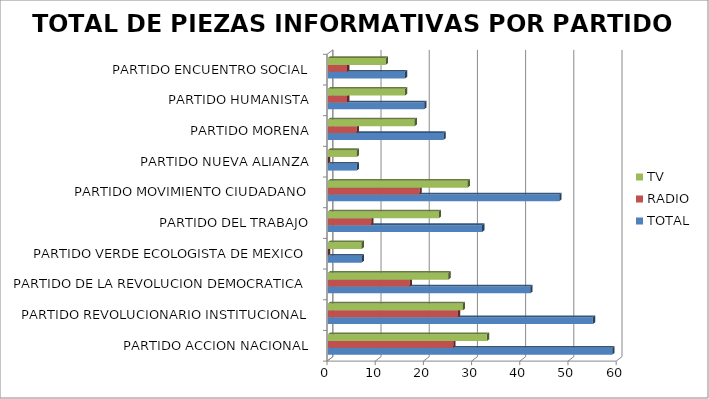
| Category | TOTAL | RADIO | TV |
|---|---|---|---|
| PARTIDO ACCION NACIONAL | 59 | 26 | 33 |
| PARTIDO REVOLUCIONARIO INSTITUCIONAL | 55 | 27 | 28 |
| PARTIDO DE LA REVOLUCION DEMOCRATICA | 42 | 17 | 25 |
| PARTIDO VERDE ECOLOGISTA DE MEXICO | 7 | 0 | 7 |
| PARTIDO DEL TRABAJO | 32 | 9 | 23 |
| PARTIDO MOVIMIENTO CIUDADANO | 48 | 19 | 29 |
| PARTIDO NUEVA ALIANZA | 6 | 0 | 6 |
| PARTIDO MORENA | 24 | 6 | 18 |
| PARTIDO HUMANISTA | 20 | 4 | 16 |
| PARTIDO ENCUENTRO SOCIAL | 16 | 4 | 12 |